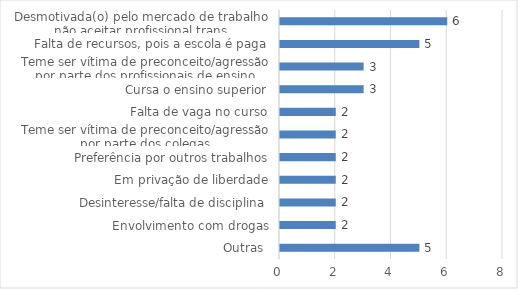
| Category | Series 0 |
|---|---|
| Outras  | 5 |
| Envolvimento com drogas | 2 |
| Desinteresse/falta de disciplina | 2 |
| Em privação de liberdade | 2 |
| Preferência por outros trabalhos | 2 |
| Teme ser vítima de preconceito/agressão por parte dos colegas | 2 |
| Falta de vaga no curso | 2 |
| Cursa o ensino superior | 3 |
| Teme ser vítima de preconceito/agressão por parte dos profissionais de ensino | 3 |
| Falta de recursos, pois a escola é paga | 5 |
| Desmotivada(o) pelo mercado de trabalho não aceitar profissional trans | 6 |